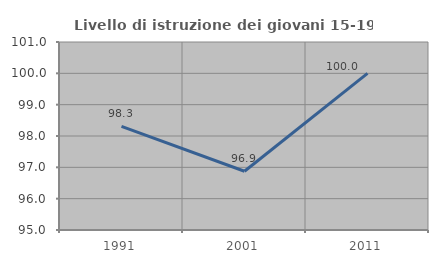
| Category | Livello di istruzione dei giovani 15-19 anni |
|---|---|
| 1991.0 | 98.305 |
| 2001.0 | 96.875 |
| 2011.0 | 100 |